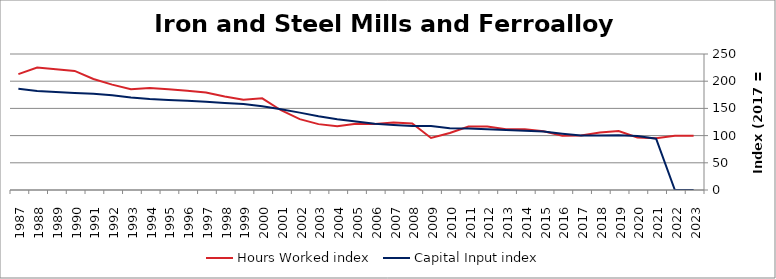
| Category | Hours Worked index | Capital Input index |
|---|---|---|
| 2023.0 | 99.856 | 0 |
| 2022.0 | 99.897 | 0 |
| 2021.0 | 94.932 | 94.373 |
| 2020.0 | 96.477 | 99.154 |
| 2019.0 | 108.326 | 100.524 |
| 2018.0 | 105.812 | 100.166 |
| 2017.0 | 100 | 100 |
| 2016.0 | 99.902 | 103.361 |
| 2015.0 | 107.861 | 107.443 |
| 2014.0 | 111.841 | 108.758 |
| 2013.0 | 111.5 | 110.332 |
| 2012.0 | 116.634 | 111.616 |
| 2011.0 | 116.586 | 112.878 |
| 2010.0 | 104.76 | 113.496 |
| 2009.0 | 95.685 | 117.473 |
| 2008.0 | 122.278 | 117.805 |
| 2007.0 | 124.181 | 119.686 |
| 2006.0 | 121.297 | 121.886 |
| 2005.0 | 121.81 | 125.935 |
| 2004.0 | 117.273 | 129.872 |
| 2003.0 | 121.084 | 135.637 |
| 2002.0 | 130.304 | 142.24 |
| 2001.0 | 146.613 | 148.582 |
| 2000.0 | 168.443 | 153.916 |
| 1999.0 | 165.907 | 157.944 |
| 1998.0 | 171.731 | 160.146 |
| 1997.0 | 179.182 | 162.161 |
| 1996.0 | 182.245 | 163.947 |
| 1995.0 | 185.361 | 165.488 |
| 1994.0 | 187.362 | 167.21 |
| 1993.0 | 185.062 | 170.213 |
| 1992.0 | 193.752 | 174.224 |
| 1991.0 | 203.988 | 176.764 |
| 1990.0 | 218.881 | 178.454 |
| 1989.0 | 221.788 | 180.027 |
| 1988.0 | 225.283 | 182.194 |
| 1987.0 | 213.012 | 186.322 |